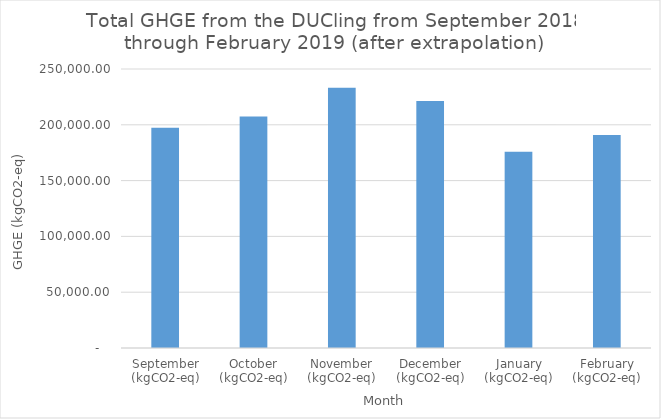
| Category | GHGE (kgCO2-eq) |
|---|---|
| September (kgCO2-eq) | 197335.587 |
| October (kgCO2-eq) | 207376.512 |
| November (kgCO2-eq) | 233222.242 |
| December (kgCO2-eq) | 221298.385 |
| January (kgCO2-eq) | 175948.938 |
| February (kgCO2-eq) | 190818.861 |